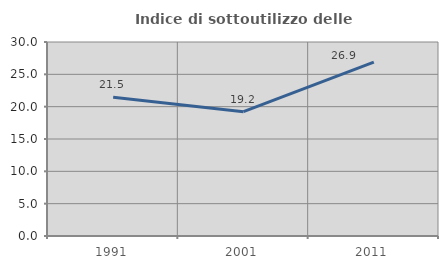
| Category | Indice di sottoutilizzo delle abitazioni  |
|---|---|
| 1991.0 | 21.47 |
| 2001.0 | 19.219 |
| 2011.0 | 26.874 |